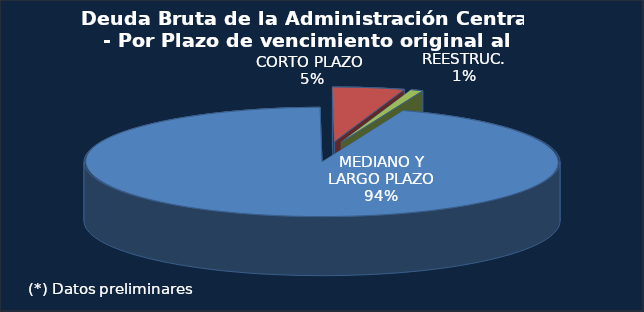
| Category | Series 0 |
|---|---|
| MEDIANO Y LARGO PLAZO | 292814.8 |
| CORTO PLAZO  | 15134.6 |
| DEUDA PENDIENTE DE REESTRUC. | 2529.4 |